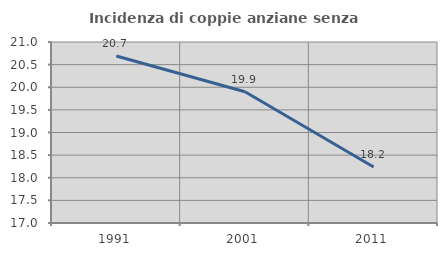
| Category | Incidenza di coppie anziane senza figli  |
|---|---|
| 1991.0 | 20.69 |
| 2001.0 | 19.9 |
| 2011.0 | 18.239 |